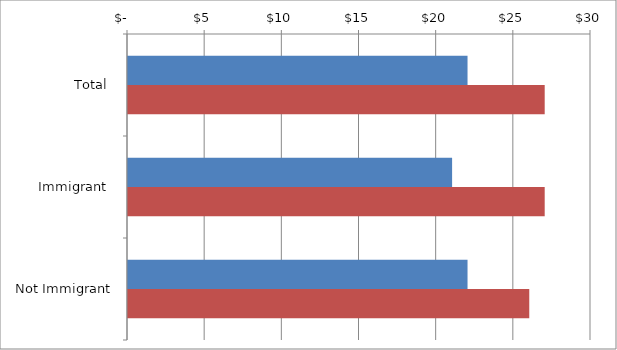
| Category | Series 0 | Series 1 |
|---|---|---|
| Total | 22 | 27 |
|  Immigrant  | 21 | 27 |
|  Not Immigrant  | 22 | 26 |